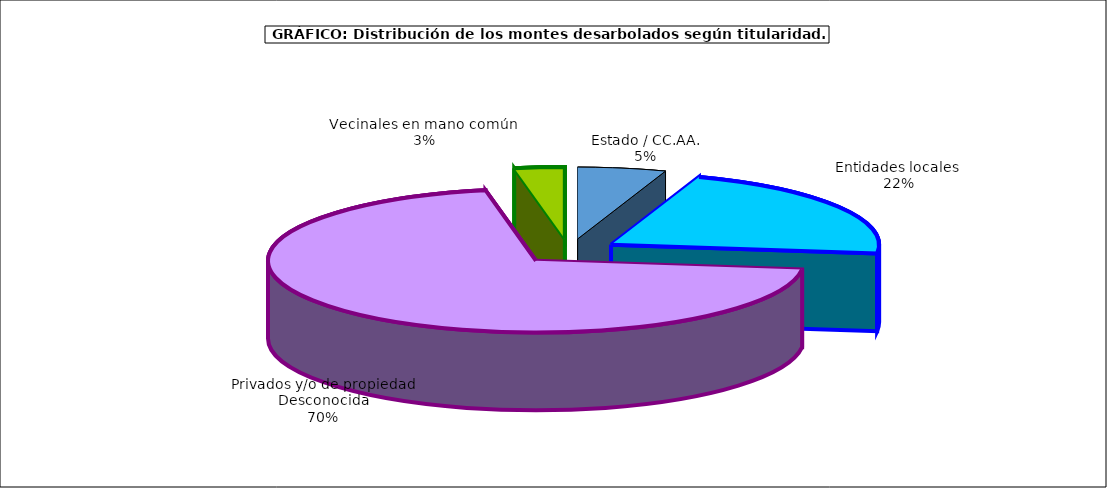
| Category | Series 0 |
|---|---|
| Estado / CC.AA. | 1479760.215 |
| Entidades locales  | 6009725.715 |
| Privados y/o de propiedad Desconocida | 19492397.969 |
| Vecinales en mano común  | 840778.239 |